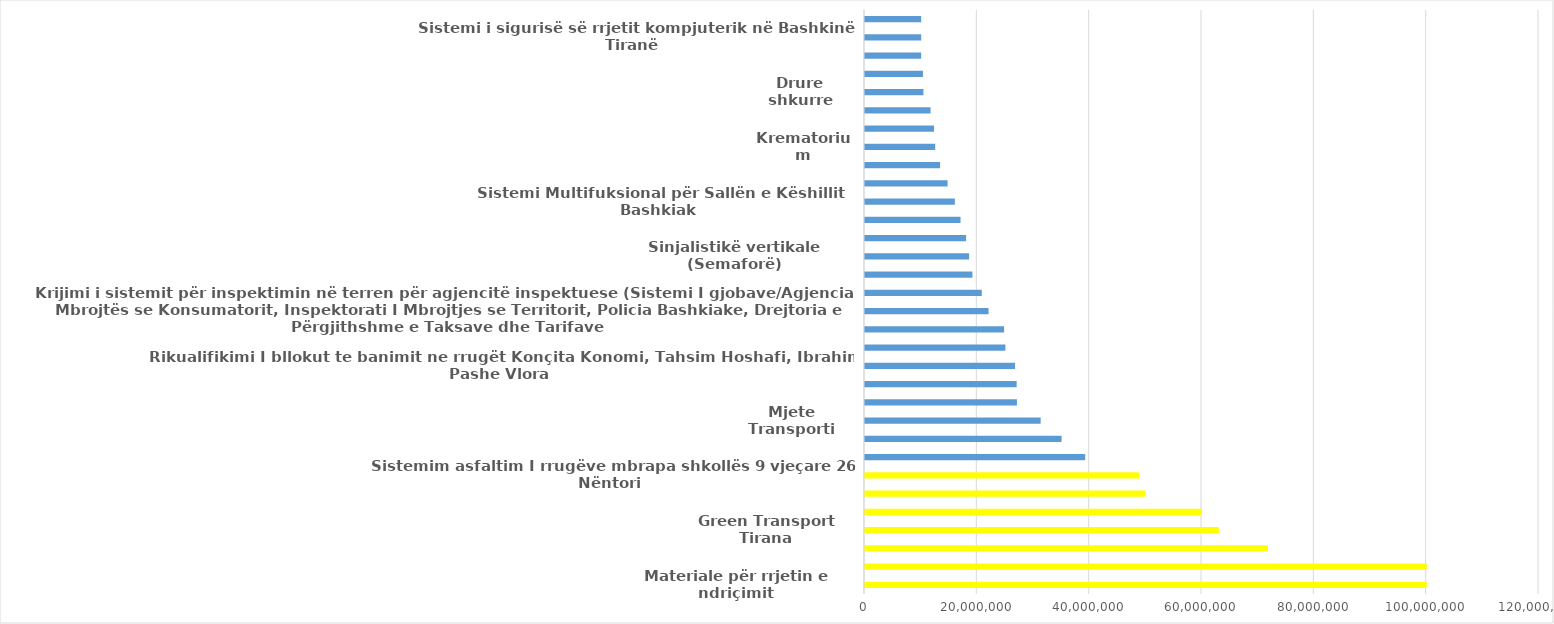
| Category | Vlera |
|---|---|
| Materiale për rrjetin e ndriçimit | 100000000 |
| Rikonstruksioni I rrugës Dytësore Tirane – Durrës (Hygea – Megatek) | 100000000 |
| Investime te pa detajuara ne programin e shërbimit publik vendor | 71739780 |
| Green Transport Tirana | 63000000 |
| Zgjerimi I nënsistemeve te Qendrës se Kontrollit te Trafikut me kamera me qark te mbyllur (CCTV); si dhe aparatura semaforike; duke përfshire integrimin e tyre me sistemet e tjera te qendrës dhe centralizimin. | 60000000 |
| Blerje zgara e puseta | 50000000 |
| Sistemim asfaltim I rrugëve mbrapa shkollës 9 vjeçare 26 Nëntori | 48813739 |
| Ndërtimi I rrugëve dytësore ne bllokun qe kufizohet nga rruga Siri Kodra – Besa -Ali Beshiri dhe Sulejman Cenoimeri | 39200000 |
| Sinjalistikë vertikale (tabela+tuba e atrecatura) | 35000000 |
| Mjete Transporti | 31275000 |
| Rikonstruksioni I bllokut te kufizuar nga rrugët Ali Baushi, Albert Minga, Kngresi I Manastirit, Ibrahim Brahja, Xhanfize keko | 27048953 |
| Ndërtimi I Rrugës Dhimiter Xhuvani | 27000000 |
| Rikualifikimi I bllokut te banimit ne rrugët Konçita Konomi, Tahsim Hoshafi, Ibrahim Pashe Vlora | 26712000 |
| Sinjalistikë horizontale (kangjella,birila,grerëza) | 25000000 |
| Rehabilitimi I qendrës Kinostudio | 24765849 |
| Krijimi i sistemit për inspektimin në terren për agjencitë inspektuese (Sistemi I gjobave/Agjencia e Mbrojtës se Konsumatorit, Inspektorati I Mbrojtjes se Territorit, Policia Bashkiake, Drejtoria e Përgjithshme e Taksave dhe Tarifave | 22000000 |
| Ndërtimi I rrugës që lidh pronën nr. 99 “Reparti Ushtarak nr.5011/45”, Surrel me rrugën nacionale | 20790000 |
| Mjete transporti | 19125000 |
| Sinjalistikë vertikale (Semaforë) | 18535165 |
| Krijimi i sistemit elektronik për masat administrative të sektorit të transporti | 18000000 |
| Ndërtimi I ambienteve për Shoqatën Humanitare te Invalidëve Paralogji dhe Tetraplegji te Shqipërisë (ShHIPTSh), në pronën nr.99, “Reparti ushtarak 5011/45”, Surrel | 17010000 |
| Sistemi Multifuksional për Sallën e Këshillit Bashkiak | 16000000 |
| Sistemim asfaltim I rrugës Vangjel Noti- Mark Bajraktari | 14699522 |
| Sistemim asfaltim I rrugës Hazbi Serani- Bego Hoxha -3 Dëshmoret dhe Sejfulla Doçi | 13372646 |
| Krematorium | 12500000 |
| Përmirësimi I sistemit Audio-Video | 12295000 |
| Sistemim asfaltim I rrugës Hamdi Sulcebe | 11673150 |
| Drure shkurre | 10400000 |
| Sistemim asfaltim I rrugës Jashar Erebara (nga rruga "Haxhi Xhediku" deri te rruga "Sulejman Cenojmeri") | 10317768 |
| Sistemi i Biletarisë Elektronike për Qendrën Kulturore Tirana | 10000000 |
| Sistemi i sigurisë së rrjetit kompjuterik në Bashkinë Tiranë  | 10000000 |
| Stola ,kosha dekorative | 10000000 |